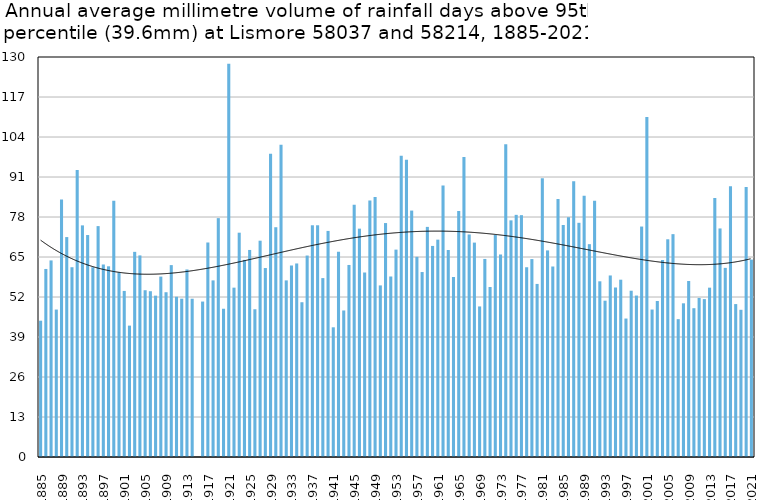
| Category | Annual average mm in days above 95th percentile |
|---|---|
| 1885 | 44.3 |
| 1886 | 61.114 |
| 1887 | 63.891 |
| 1888 | 47.917 |
| 1889 | 83.678 |
| 1890 | 71.475 |
| 1891 | 61.675 |
| 1892 | 93.289 |
| 1893 | 75.277 |
| 1894 | 72.14 |
| 1895 | 61.68 |
| 1896 | 75.04 |
| 1897 | 62.567 |
| 1898 | 61.978 |
| 1899 | 83.3 |
| 1900 | 60.017 |
| 1901 | 53.975 |
| 1902 | 42.7 |
| 1903 | 66.675 |
| 1904 | 65.52 |
| 1905 | 54.2 |
| 1906 | 53.88 |
| 1907 | 52.44 |
| 1908 | 58.633 |
| 1909 | 53.55 |
| 1910 | 62.364 |
| 1911 | 52.067 |
| 1912 | 51.45 |
| 1913 | 60.95 |
| 1914 | 51.44 |
| 1915 | 0 |
| 1916 | 50.517 |
| 1917 | 69.714 |
| 1918 | 57.4 |
| 1919 | 77.633 |
| 1920 | 48.178 |
| 1921 | 127.8 |
| 1922 | 55.038 |
| 1923 | 72.9 |
| 1924 | 64.06 |
| 1925 | 67.288 |
| 1926 | 48.017 |
| 1927 | 70.3 |
| 1928 | 61.411 |
| 1929 | 98.591 |
| 1930 | 74.675 |
| 1931 | 101.467 |
| 1932 | 57.4 |
| 1933 | 62.218 |
| 1934 | 62.9 |
| 1935 | 50.3 |
| 1936 | 65.475 |
| 1937 | 75.31 |
| 1938 | 75.314 |
| 1939 | 58.144 |
| 1940 | 73.475 |
| 1941 | 42.15 |
| 1942 | 66.671 |
| 1943 | 47.622 |
| 1944 | 62.414 |
| 1945 | 81.986 |
| 1946 | 74.214 |
| 1947 | 59.96 |
| 1948 | 83.4 |
| 1949 | 84.46 |
| 1950 | 55.767 |
| 1951 | 76.033 |
| 1952 | 58.667 |
| 1953 | 67.4 |
| 1954 | 97.88 |
| 1955 | 96.64 |
| 1956 | 80.089 |
| 1957 | 65.05 |
| 1958 | 60.114 |
| 1959 | 74.787 |
| 1960 | 68.6 |
| 1961 | 70.64 |
| 1962 | 88.217 |
| 1963 | 67.269 |
| 1964 | 58.48 |
| 1965 | 79.95 |
| 1966 | 97.533 |
| 1967 | 72.323 |
| 1968 | 69.678 |
| 1969 | 48.933 |
| 1970 | 64.371 |
| 1971 | 55.25 |
| 1972 | 72.169 |
| 1973 | 65.8 |
| 1974 | 101.677 |
| 1975 | 76.91 |
| 1976 | 78.7 |
| 1977 | 78.6 |
| 1978 | 61.671 |
| 1979 | 64.325 |
| 1980 | 56.25 |
| 1981 | 90.567 |
| 1982 | 67.143 |
| 1983 | 61.912 |
| 1984 | 83.822 |
| 1985 | 75.4 |
| 1986 | 77.933 |
| 1987 | 89.617 |
| 1988 | 76.115 |
| 1989 | 84.867 |
| 1990 | 69.171 |
| 1991 | 83.3 |
| 1992 | 57.1 |
| 1993 | 50.8 |
| 1994 | 59 |
| 1995 | 55.08 |
| 1996 | 57.625 |
| 1997 | 45 |
| 1998 | 54.04 |
| 1999 | 52.467 |
| 2000 | 74.9 |
| 2001 | 110.52 |
| 2002 | 47.925 |
| 2003 | 50.7 |
| 2004 | 64.029 |
| 2005 | 70.76 |
| 2006 | 72.429 |
| 2007 | 44.8 |
| 2008 | 49.95 |
| 2009 | 57.2 |
| 2010 | 48.36 |
| 2011 | 51.7 |
| 2012 | 51.32 |
| 2013 | 55.036 |
| 2014 | 84.15 |
| 2015 | 74.28 |
| 2016 | 61.467 |
| 2017 | 88.015 |
| 2018 | 49.7 |
| 2019 | 47.84 |
| 2020 | 87.72 |
| 2021 | 64.16 |